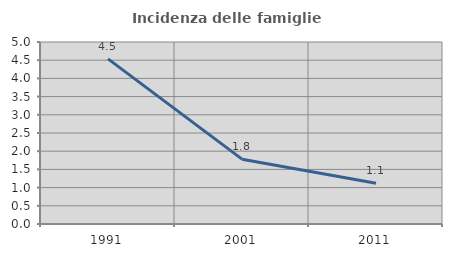
| Category | Incidenza delle famiglie numerose |
|---|---|
| 1991.0 | 4.536 |
| 2001.0 | 1.781 |
| 2011.0 | 1.121 |